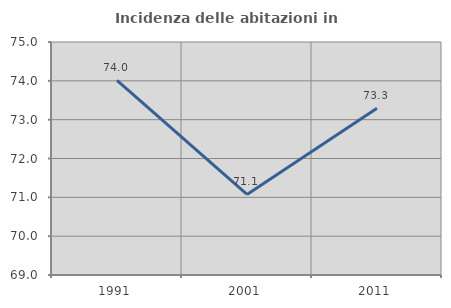
| Category | Incidenza delle abitazioni in proprietà  |
|---|---|
| 1991.0 | 74.009 |
| 2001.0 | 71.074 |
| 2011.0 | 73.295 |